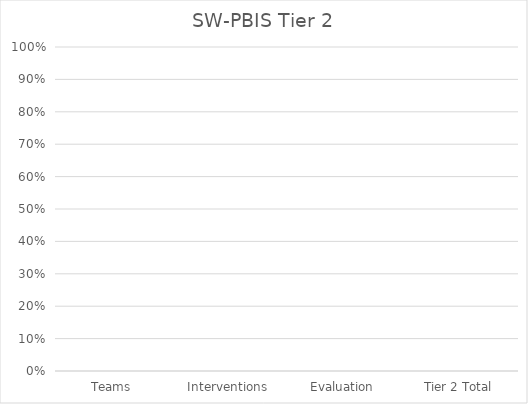
| Category | Series 0 |
|---|---|
| Teams | 0 |
| Interventions | 0 |
| Evaluation | 0 |
| Tier 2 Total | 0 |